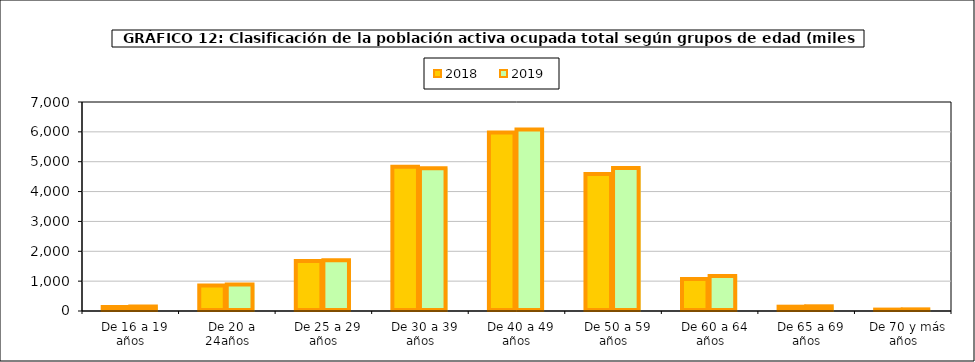
| Category | 2018 | 2019 |
|---|---|---|
|   De 16 a 19 años | 134.025 | 150.45 |
|   De 20 a 24años | 855.275 | 888.175 |
|   De 25 a 29 años | 1673 | 1701.725 |
|   De 30 a 39 años | 4834.3 | 4783.225 |
|   De 40 a 49 años | 5974.8 | 6079.5 |
|   De 50 a 59 años | 4589.5 | 4790.5 |
|   De 60 a 64 años | 1075.4 | 1174.275 |
|   De 65 a 69 años | 144.35 | 156.875 |
|   De 70 y más años | 47.025 | 54.525 |